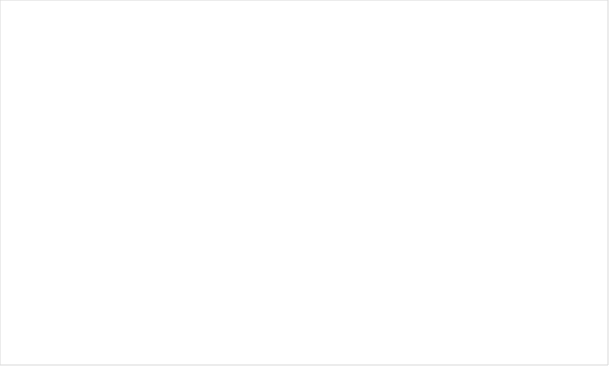
| Category | Ingen brist | Föreläggande |
|---|---|---|
| Enskild en enhet | 0.967 | 0.033 |
| Enskild flera enhet | 0.966 | 0.034 |